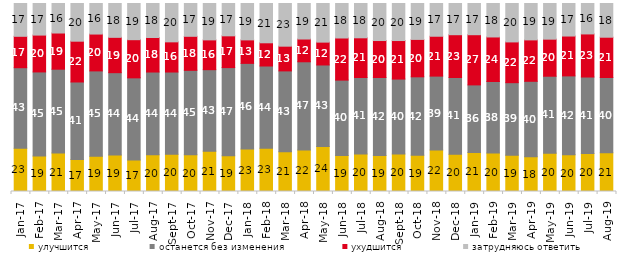
| Category | улучшится | останется без изменения | ухудшится | затрудняюсь ответить |
|---|---|---|---|---|
| 2017-01-01 | 23 | 42.85 | 16.7 | 17.45 |
| 2017-02-01 | 18.85 | 44.75 | 19.6 | 16.8 |
| 2017-03-01 | 20.5 | 44.55 | 19.25 | 15.7 |
| 2017-04-01 | 17 | 41.25 | 21.7 | 20.05 |
| 2017-05-01 | 18.7 | 45.45 | 19.6 | 16.25 |
| 2017-06-01 | 19.4 | 43.8 | 18.8 | 18 |
| 2017-07-01 | 16.7 | 43.75 | 20.3 | 19.25 |
| 2017-08-01 | 19.5 | 44.05 | 18.35 | 18.1 |
| 2017-09-01 | 19.8 | 43.75 | 16.05 | 20.4 |
| 2017-10-01 | 19.55 | 44.9 | 18.1 | 17.45 |
| 2017-11-01 | 21.45 | 43.35 | 15.85 | 19.35 |
| 2017-12-01 | 18.95 | 46.95 | 16.9 | 17.2 |
| 2018-01-01 | 22.55 | 45.6 | 12.5 | 19.35 |
| 2018-02-01 | 23 | 43.75 | 12.35 | 20.9 |
| 2018-03-01 | 21.15 | 43 | 13.15 | 22.7 |
| 2018-04-01 | 22.05 | 46.95 | 12.1 | 18.9 |
| 2018-05-01 | 23.95 | 43.35 | 12.15 | 20.55 |
| 2018-06-01 | 19.15 | 40.1 | 22.4 | 18.35 |
| 2018-07-01 | 19.95 | 40.7 | 21.1 | 18.25 |
| 2018-08-01 | 19.15 | 41.5 | 19.65 | 19.7 |
| 2018-09-01 | 19.95 | 39.85 | 20.5 | 19.7 |
| 2018-10-01 | 19.3 | 41.7 | 19.9 | 19.1 |
| 2018-11-01 | 22.056 | 39.321 | 21.208 | 17.415 |
| 2018-12-01 | 19.8 | 40.85 | 22.75 | 16.6 |
| 2019-01-01 | 20.75 | 35.95 | 26.7 | 16.6 |
| 2019-02-01 | 20.45 | 38.05 | 23.7 | 17.8 |
| 2019-03-01 | 19.344 | 38.538 | 21.681 | 20.438 |
| 2019-04-01 | 18.465 | 40.149 | 22.03 | 19.356 |
| 2019-05-01 | 20.406 | 40.911 | 19.713 | 18.97 |
| 2019-06-01 | 19.601 | 41.895 | 21.197 | 17.307 |
| 2019-07-01 | 20.149 | 40.743 | 22.921 | 16.188 |
| 2019-08-01 | 20.579 | 40.06 | 21.429 | 17.932 |